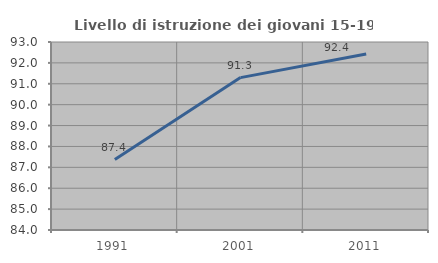
| Category | Livello di istruzione dei giovani 15-19 anni |
|---|---|
| 1991.0 | 87.373 |
| 2001.0 | 91.295 |
| 2011.0 | 92.421 |